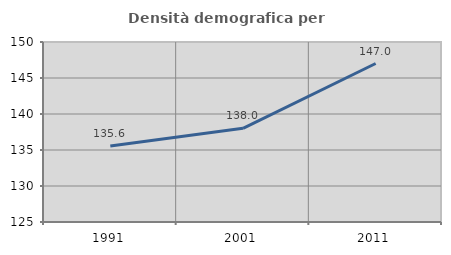
| Category | Densità demografica |
|---|---|
| 1991.0 | 135.556 |
| 2001.0 | 138.015 |
| 2011.0 | 147.014 |